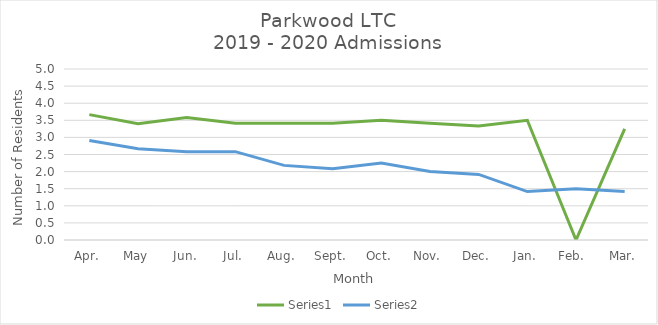
| Category | Series 0 | Series 1 |
|---|---|---|
| Apr. | 3.667 | 2.909 |
| May | 3.4 | 2.667 |
| Jun. | 3.583 | 2.583 |
| Jul. | 3.417 | 2.583 |
| Aug. | 3.417 | 2.182 |
| Sept. | 3.417 | 2.083 |
| Oct. | 3.5 | 2.25 |
| Nov. | 3.417 | 2 |
| Dec. | 3.333 | 1.917 |
| Jan. | 3.5 | 1.417 |
| Feb.  | 0 | 1.5 |
| Mar. | 3.25 | 1.417 |